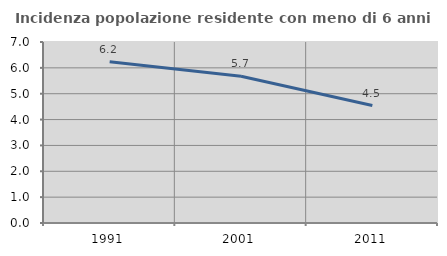
| Category | Incidenza popolazione residente con meno di 6 anni |
|---|---|
| 1991.0 | 6.235 |
| 2001.0 | 5.675 |
| 2011.0 | 4.541 |